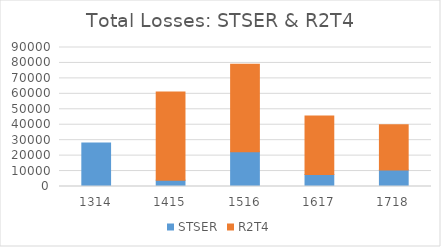
| Category | STSER | R2T4 |
|---|---|---|
| 1314.0 | 28097 | 0 |
| 1415.0 | 4096.56 | 57039 |
| 1516.0 | 22496.05 | 56649 |
| 1617.0 | 7792 | 37897 |
| 1718.0 | 10762 | 29235 |